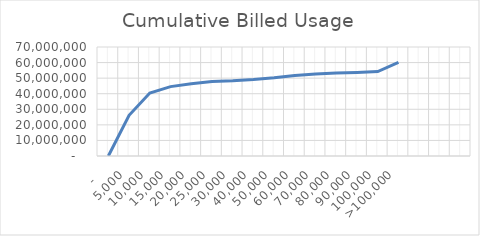
| Category | Series 0 |
|---|---|
|  -    | 0 |
|  5,000  | 26137300 |
|  10,000  | 40456000 |
|  15,000  | 44566600 |
|  20,000  | 46452300 |
|  25,000  | 47830200 |
|  30,000  | 48327300 |
|  40,000  | 49124800 |
|  50,000  | 50278300 |
|  60,000  | 51767600 |
|  70,000  | 52667800 |
|  80,000  | 53252300 |
|  90,000  | 53678500 |
|  100,000  | 54257900 |
|  >100,000  | 60067100 |